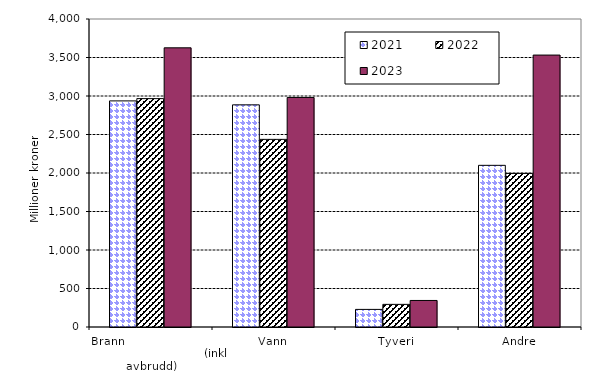
| Category | 2021 | 2022 | 2023 |
|---|---|---|---|
| Brann                                                       (inkl avbrudd) | 2936.311 | 2966.092 | 3625.617 |
| Vann | 2885.078 | 2436.698 | 2981.052 |
| Tyveri | 228.679 | 293.939 | 344.724 |
| Andre | 2099.459 | 1994.35 | 3531.461 |